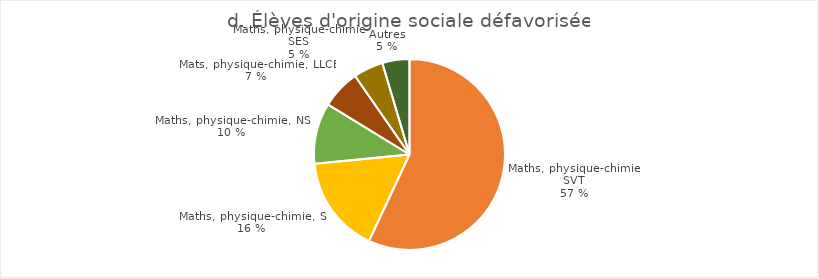
| Category | Élèves d'origine sociale défavorisée |
|---|---|
| Mathématiques, physique-chimie, SVT | 5728 |
| Mathématiques, physique-chimie, SI | 1656 |
| Mathématiques, physique-chimie, NSI | 1038 |
| Mathématiques, physique-chimie, LLCER | 662 |
| Mathématiques, physique-chimie, SES | 509 |
| Autres | 462 |